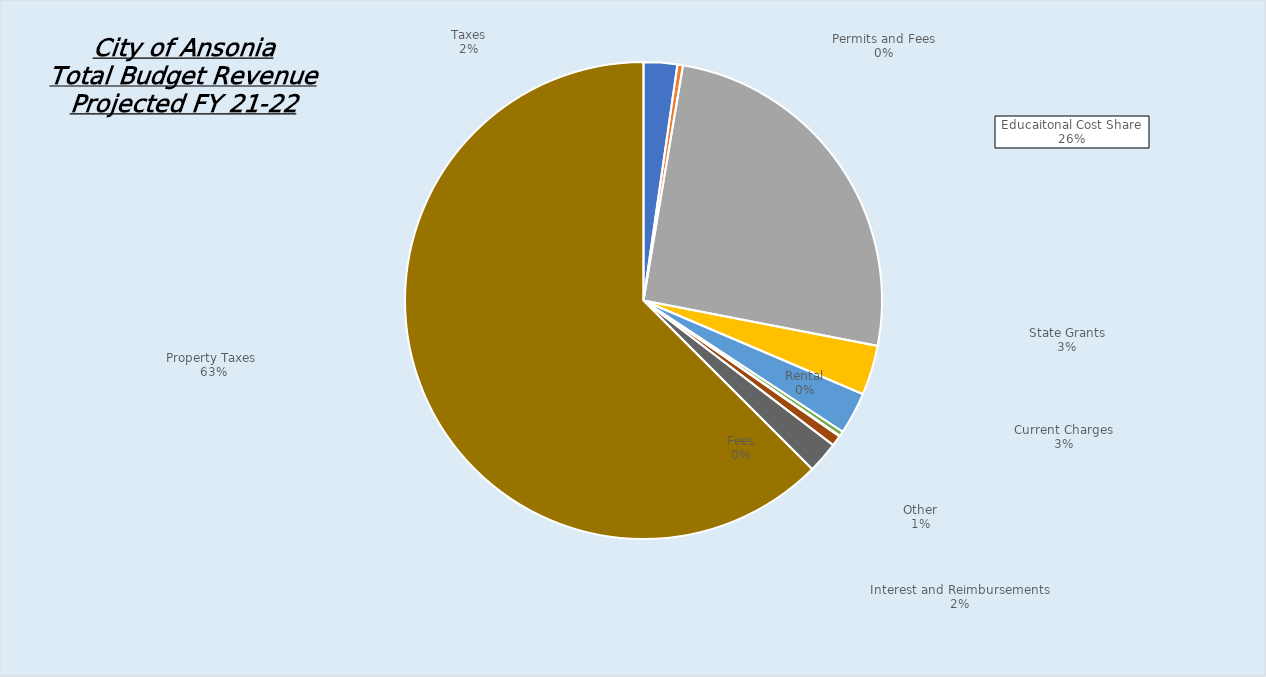
| Category | Series 0 |
|---|---|
|  Taxes  | 1346400 |
|  Permits and Fees  | 221500 |
|  Educaitonal Cost Share  | 15031668 |
|  State Grants  | 1994286 |
| Current Charges | 1689000 |
| Fees | 195600 |
| Rental | 27200 |
| Other | 424500 |
| Interest and Reimbursements | 1260500 |
|  Property Taxes   | 36990318.246 |